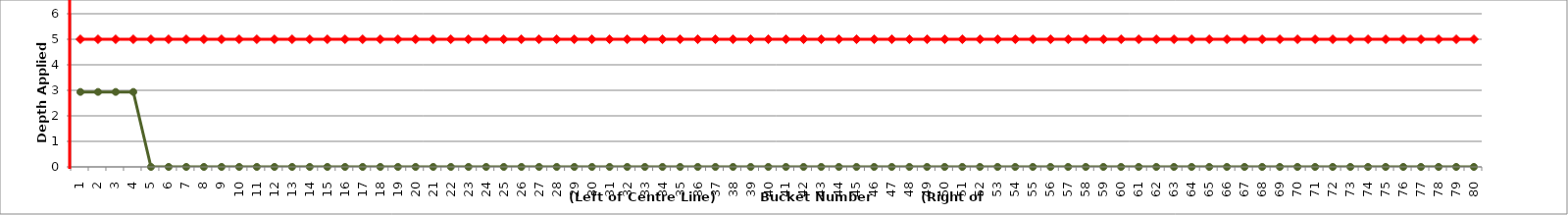
| Category | Maximum Allowable | Actual Applied Depth |
|---|---|---|
| 1.0 | 5 | 2.937 |
| 2.0 | 5 | 2.937 |
| 3.0 | 5 | 2.937 |
| 4.0 | 5 | 2.937 |
| 5.0 | 5 | 0 |
| 6.0 | 5 | 0 |
| 7.0 | 5 | 0 |
| 8.0 | 5 | 0 |
| 9.0 | 5 | 0 |
| 10.0 | 5 | 0 |
| 11.0 | 5 | 0 |
| 12.0 | 5 | 0 |
| 13.0 | 5 | 0 |
| 14.0 | 5 | 0 |
| 15.0 | 5 | 0 |
| 16.0 | 5 | 0 |
| 17.0 | 5 | 0 |
| 18.0 | 5 | 0 |
| 19.0 | 5 | 0 |
| 20.0 | 5 | 0 |
| 21.0 | 5 | 0 |
| 22.0 | 5 | 0 |
| 23.0 | 5 | 0 |
| 24.0 | 5 | 0 |
| 25.0 | 5 | 0 |
| 26.0 | 5 | 0 |
| 27.0 | 5 | 0 |
| 28.0 | 5 | 0 |
| 29.0 | 5 | 0 |
| 30.0 | 5 | 0 |
| 31.0 | 5 | 0 |
| 32.0 | 5 | 0 |
| 33.0 | 5 | 0 |
| 34.0 | 5 | 0 |
| 35.0 | 5 | 0 |
| 36.0 | 5 | 0 |
| 37.0 | 5 | 0 |
| 38.0 | 5 | 0 |
| 39.0 | 5 | 0 |
| 40.0 | 5 | 0 |
| 41.0 | 5 | 0 |
| 42.0 | 5 | 0 |
| 43.0 | 5 | 0 |
| 44.0 | 5 | 0 |
| 45.0 | 5 | 0 |
| 46.0 | 5 | 0 |
| 47.0 | 5 | 0 |
| 48.0 | 5 | 0 |
| 49.0 | 5 | 0 |
| 50.0 | 5 | 0 |
| 51.0 | 5 | 0 |
| 52.0 | 5 | 0 |
| 53.0 | 5 | 0 |
| 54.0 | 5 | 0 |
| 55.0 | 5 | 0 |
| 56.0 | 5 | 0 |
| 57.0 | 5 | 0 |
| 58.0 | 5 | 0 |
| 59.0 | 5 | 0 |
| 60.0 | 5 | 0 |
| 61.0 | 5 | 0 |
| 62.0 | 5 | 0 |
| 63.0 | 5 | 0 |
| 64.0 | 5 | 0 |
| 65.0 | 5 | 0 |
| 66.0 | 5 | 0 |
| 67.0 | 5 | 0 |
| 68.0 | 5 | 0 |
| 69.0 | 5 | 0 |
| 70.0 | 5 | 0 |
| 71.0 | 5 | 0 |
| 72.0 | 5 | 0 |
| 73.0 | 5 | 0 |
| 74.0 | 5 | 0 |
| 75.0 | 5 | 0 |
| 76.0 | 5 | 0 |
| 77.0 | 5 | 0 |
| 78.0 | 5 | 0 |
| 79.0 | 5 | 0 |
| 80.0 | 5 | 0 |